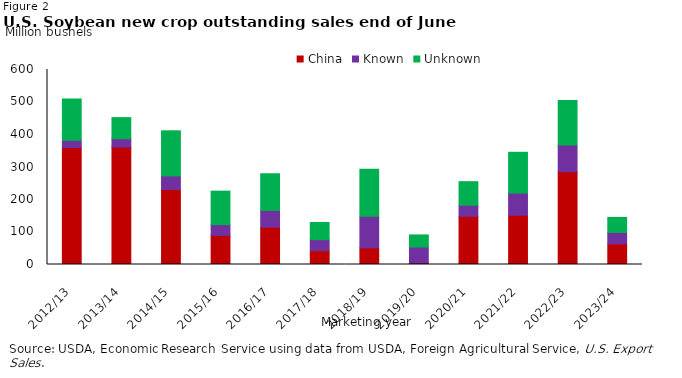
| Category | China | Known | Unknown |
|---|---|---|---|
| 2012/13 | 359.776 | 22.414 | 126.821 |
| 2013/14 | 361.282 | 25.792 | 64.926 |
| 2014/15 | 230.585 | 41.972 | 138.829 |
| 2015/16 | 89.471 | 33.212 | 103.04 |
| 2016/17 | 114.677 | 51.767 | 112.753 |
| 2017/18 | 42.659 | 33.832 | 52.69 |
| 2018/19 | 51.147 | 97.597 | 144.55 |
| 2019/20 | 4.63 | 49.013 | 37.332 |
| 2020/21 | 148.261 | 34.164 | 72.459 |
| 2021/22 | 151.751 | 68.034 | 125.528 |
| 2022/23 | 285.315 | 82.382 | 137.076 |
| 2023/24 | 63.273 | 35.18 | 46.481 |